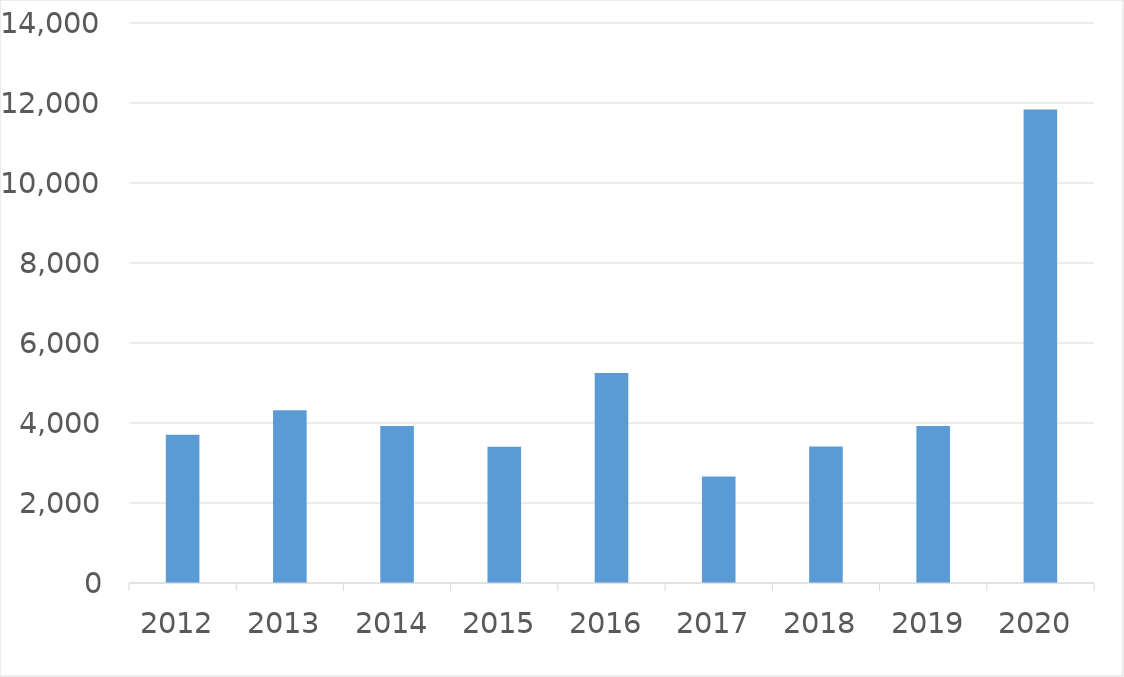
| Category | Series 0 |
|---|---|
| 2012 | 3706 |
| 2013 | 4321 |
| 2014 | 3928 |
| 2015 | 3405 |
| 2016 | 5249 |
| 2017 | 2664 |
| 2018 | 3410 |
| 2019 | 3923 |
| 2020 | 11835 |